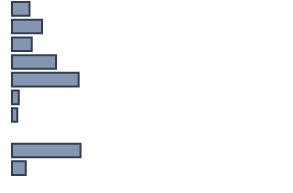
| Category | Series 0 |
|---|---|
| 0 | 6.4 |
| 1 | 11 |
| 2 | 7.3 |
| 3 | 16.2 |
| 4 | 24.5 |
| 5 | 2.5 |
| 6 | 1.9 |
| 7 | 0 |
| 8 | 25.2 |
| 9 | 5.1 |